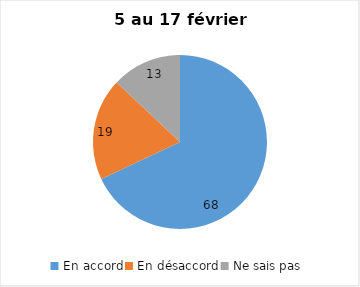
| Category | Series 0 |
|---|---|
| En accord | 68 |
| En désaccord | 19 |
| Ne sais pas | 13 |